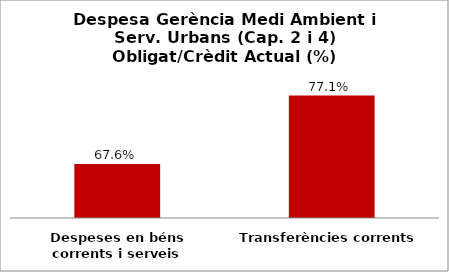
| Category | Series 0 |
|---|---|
| Despeses en béns corrents i serveis | 0.676 |
| Transferències corrents | 0.771 |